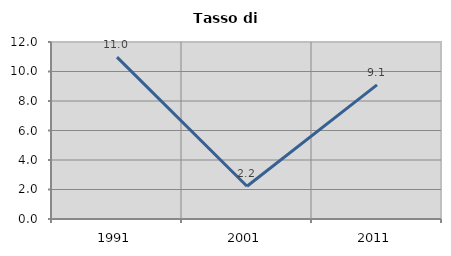
| Category | Tasso di disoccupazione   |
|---|---|
| 1991.0 | 10.976 |
| 2001.0 | 2.222 |
| 2011.0 | 9.091 |